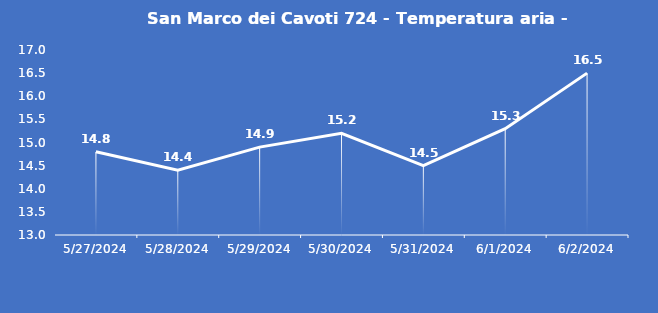
| Category | San Marco dei Cavoti 724 - Temperatura aria - Grezzo (°C) |
|---|---|
| 5/27/24 | 14.8 |
| 5/28/24 | 14.4 |
| 5/29/24 | 14.9 |
| 5/30/24 | 15.2 |
| 5/31/24 | 14.5 |
| 6/1/24 | 15.3 |
| 6/2/24 | 16.5 |